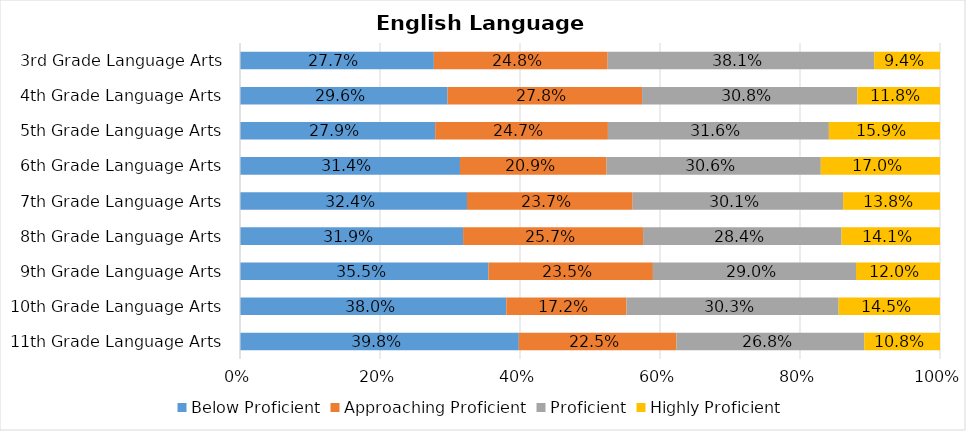
| Category | Below Proficient | Approaching Proficient | Proficient | Highly Proficient |
|---|---|---|---|---|
| 11th Grade Language Arts | 0.398 | 0.225 | 0.268 | 0.108 |
| 10th Grade Language Arts | 0.38 | 0.172 | 0.303 | 0.145 |
| 9th Grade Language Arts | 0.355 | 0.235 | 0.29 | 0.12 |
| 8th Grade Language Arts | 0.319 | 0.257 | 0.284 | 0.141 |
| 7th Grade Language Arts | 0.324 | 0.237 | 0.301 | 0.138 |
| 6th Grade Language Arts | 0.314 | 0.209 | 0.306 | 0.17 |
| 5th Grade Language Arts | 0.279 | 0.247 | 0.316 | 0.159 |
| 4th Grade Language Arts | 0.296 | 0.278 | 0.308 | 0.118 |
| 3rd Grade Language Arts | 0.277 | 0.248 | 0.381 | 0.094 |